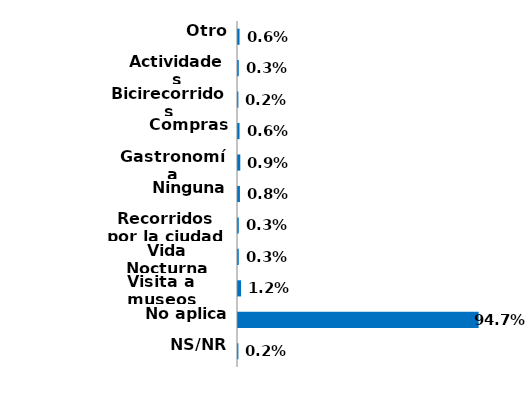
| Category | Series 0 |
|---|---|
| Otro | 0.006 |
| Actividades culturales | 0.003 |
| Bicirecorridos | 0.002 |
| Compras | 0.006 |
| Gastronomía | 0.009 |
| Ninguna | 0.008 |
| Recorridos por la ciudad | 0.003 |
| Vida Nocturna | 0.003 |
| Visita a museos | 0.012 |
| No aplica | 0.947 |
| NS/NR | 0.002 |